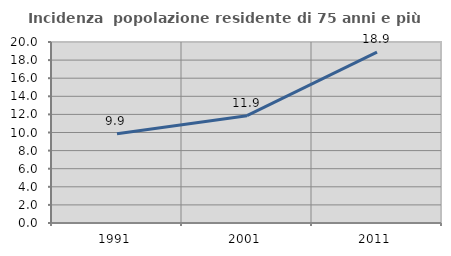
| Category | Incidenza  popolazione residente di 75 anni e più |
|---|---|
| 1991.0 | 9.852 |
| 2001.0 | 11.858 |
| 2011.0 | 18.889 |